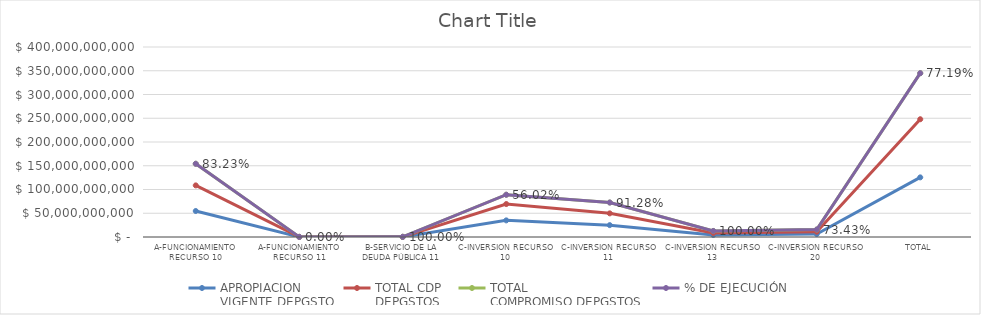
| Category | APROPIACION
VIGENTE DEPGSTO | TOTAL CDP
DEPGSTOS | TOTAL
COMPROMISO DEPGSTOS | % DE EJECUCIÓN |
|---|---|---|---|---|
| A-FUNCIONAMIENTO RECURSO 10 | 54704000000 | 53946616283.13 | 45527817884.68 | 0.832 |
| A-FUNCIONAMIENTO RECURSO 11 | 231000000 | 0 | 0 | 0 |
| B-SERVICIO DE LA DEUDA PÚBLICA 11 | 131748779 | 131748779 | 131748778.8 | 1 |
| C-INVERSION RECURSO 10 | 35000000000 | 34372456499 | 19605979608.17 | 0.56 |
| C-INVERSION RECURSO 11 | 24983074635 | 24792998293.41 | 22804035949.24 | 0.913 |
| C-INVERSION RECURSO 13 | 4242000000 | 4242000000 | 4242000000 | 1 |
| C-INVERSION RECURSO 20 | 6251000000 | 4913788994.42 | 4590289861.42 | 0.734 |
| TOTAL | 125542823414 | 122399608848.96 | 96901872082.31 | 0.772 |